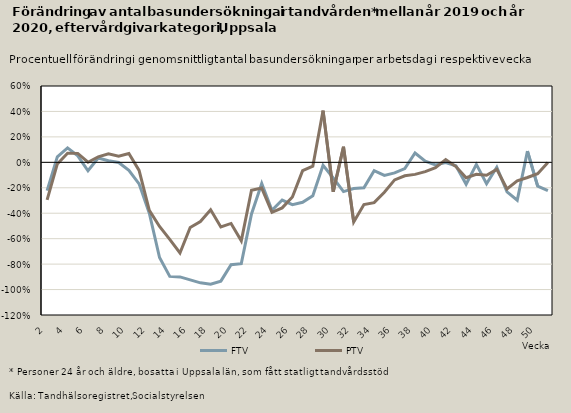
| Category | FTV | PTV |
|---|---|---|
| 2.0 | -0.222 | -0.295 |
| 3.0 | 0.044 | -0.012 |
| 4.0 | 0.113 | 0.072 |
| 5.0 | 0.051 | 0.07 |
| 6.0 | -0.066 | 0.001 |
| 7.0 | 0.034 | 0.043 |
| 8.0 | 0.012 | 0.067 |
| 9.0 | -0.001 | 0.049 |
| 10.0 | -0.063 | 0.07 |
| 11.0 | -0.169 | -0.063 |
| 12.0 | -0.4 | -0.377 |
| 13.0 | -0.749 | -0.504 |
| 14.0 | -0.896 | -0.606 |
| 15.0 | -0.901 | -0.713 |
| 16.0 | -0.924 | -0.512 |
| 17.0 | -0.947 | -0.465 |
| 18.0 | -0.959 | -0.372 |
| 19.0 | -0.934 | -0.508 |
| 20.0 | -0.804 | -0.48 |
| 21.0 | -0.797 | -0.616 |
| 22.0 | -0.406 | -0.219 |
| 23.0 | -0.167 | -0.202 |
| 24.0 | -0.378 | -0.393 |
| 25.0 | -0.297 | -0.358 |
| 26.0 | -0.333 | -0.273 |
| 27.0 | -0.314 | -0.065 |
| 28.0 | -0.263 | -0.03 |
| 29.0 | -0.023 | 0.406 |
| 30.0 | -0.123 | -0.231 |
| 31.0 | -0.23 | 0.122 |
| 32.0 | -0.206 | -0.469 |
| 33.0 | -0.2 | -0.332 |
| 34.0 | -0.065 | -0.317 |
| 35.0 | -0.103 | -0.235 |
| 36.0 | -0.083 | -0.138 |
| 37.0 | -0.05 | -0.106 |
| 38.0 | 0.074 | -0.095 |
| 39.0 | 0.008 | -0.073 |
| 40.0 | -0.02 | -0.042 |
| 41.0 | -0.001 | 0.022 |
| 42.0 | -0.027 | -0.033 |
| 43.0 | -0.172 | -0.12 |
| 44.0 | -0.016 | -0.094 |
| 45.0 | -0.169 | -0.101 |
| 46.0 | -0.038 | -0.055 |
| 47.0 | -0.232 | -0.209 |
| 48.0 | -0.298 | -0.146 |
| 49.0 | 0.088 | -0.119 |
| 50.0 | -0.187 | -0.09 |
| 51.0 | -0.222 | -0.001 |